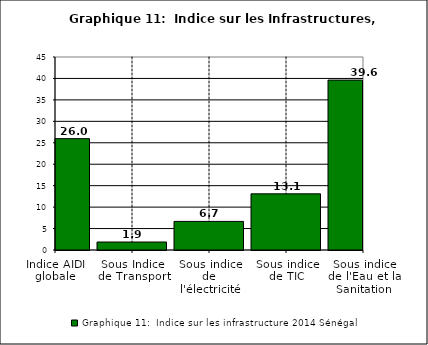
| Category | Graphique 11:  Indice sur les infrastructure 2014 |
|---|---|
| Indice AIDI globale | 25.959 |
| Sous Indice de Transport | 1.859 |
| Sous indice de l'électricité | 6.667 |
| Sous indice de TIC | 13.092 |
| Sous indice de l'Eau et la Sanitation | 39.617 |